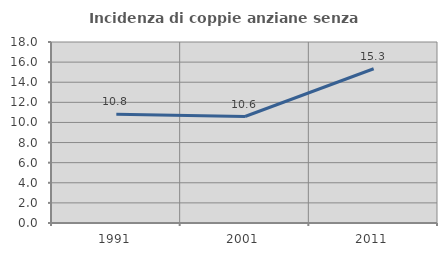
| Category | Incidenza di coppie anziane senza figli  |
|---|---|
| 1991.0 | 10.823 |
| 2001.0 | 10.591 |
| 2011.0 | 15.339 |